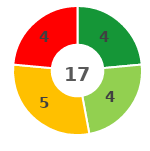
| Category | Series 0 |
|---|---|
| 0 | 4 |
| 1 | 4 |
| 2 | 5 |
| 3 | 4 |
| 4 | 0 |